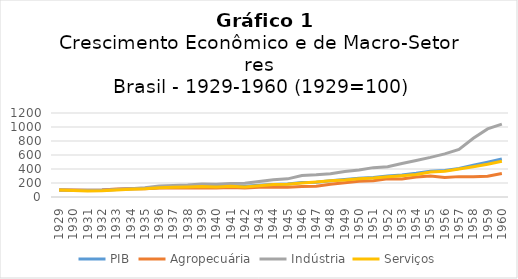
| Category | PIB | Agropecuária | Indústria | Serviços |
|---|---|---|---|---|
| 1929.0 | 100 | 100 | 100 | 100 |
| 1930.0 | 97.876 | 101.2 | 93.3 | 91.4 |
| 1931.0 | 94.689 | 94.824 | 94.42 | 86.83 |
| 1932.0 | 98.786 | 100.514 | 95.741 | 88.046 |
| 1933.0 | 107.587 | 112.576 | 106.943 | 101.429 |
| 1934.0 | 117.451 | 119.555 | 118.814 | 110.76 |
| 1935.0 | 120.941 | 116.566 | 132.953 | 117.295 |
| 1936.0 | 135.508 | 127.64 | 155.821 | 132.66 |
| 1937.0 | 141.73 | 127.768 | 164.235 | 140.222 |
| 1938.0 | 148.103 | 133.134 | 170.312 | 143.027 |
| 1939.0 | 151.745 | 130.072 | 186.151 | 148.748 |
| 1940.0 | 150.228 | 127.731 | 181.125 | 143.244 |
| 1941.0 | 157.663 | 135.778 | 192.717 | 151.982 |
| 1942.0 | 153.414 | 129.803 | 195.415 | 142.255 |
| 1943.0 | 166.464 | 139.279 | 221.796 | 161.459 |
| 1944.0 | 179.059 | 142.622 | 245.528 | 177.282 |
| 1945.0 | 184.826 | 139.484 | 259.032 | 182.424 |
| 1946.0 | 206.222 | 151.201 | 306.953 | 201.031 |
| 1947.0 | 211.229 | 152.259 | 317.082 | 215.505 |
| 1948.0 | 231.718 | 182.555 | 332.97 | 231.634 |
| 1949.0 | 249.561 | 203.265 | 365.688 | 242.079 |
| 1950.0 | 266.531 | 225.702 | 385.328 | 260.628 |
| 1951.0 | 279.591 | 231.587 | 419.548 | 270.3 |
| 1952.0 | 300.001 | 260.941 | 433.403 | 288.745 |
| 1953.0 | 314.101 | 258.436 | 477.472 | 304.11 |
| 1954.0 | 338.601 | 285.202 | 522.098 | 321.967 |
| 1955.0 | 368.398 | 301.49 | 565.688 | 356.232 |
| 1956.0 | 379.081 | 277.802 | 615.965 | 369.35 |
| 1957.0 | 408.271 | 291.057 | 680.093 | 400.912 |
| 1958.0 | 452.364 | 289.187 | 840.058 | 432.044 |
| 1959.0 | 496.696 | 296.245 | 972.535 | 466.903 |
| 1960.0 | 543.385 | 334.447 | 1040.021 | 511.818 |